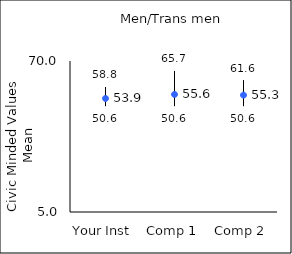
| Category | 25th percentile | 75th percentile | Mean |
|---|---|---|---|
| Your Inst | 50.6 | 58.8 | 53.88 |
| Comp 1 | 50.6 | 65.7 | 55.61 |
| Comp 2 | 50.6 | 61.6 | 55.31 |